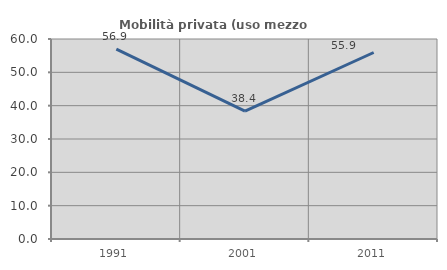
| Category | Mobilità privata (uso mezzo privato) |
|---|---|
| 1991.0 | 56.934 |
| 2001.0 | 38.367 |
| 2011.0 | 55.947 |